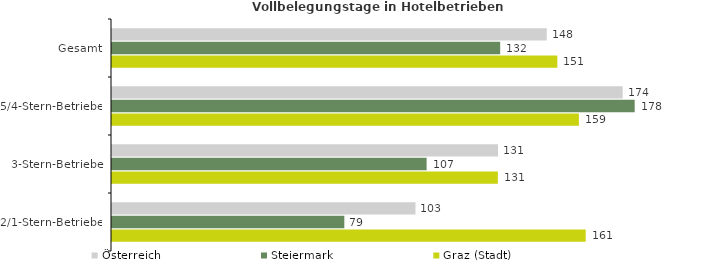
| Category | Österreich | Steiermark | Graz (Stadt) |
|---|---|---|---|
| Gesamt | 147.876 | 132.038 | 151.479 |
| 5/4-Stern-Betriebe | 173.697 | 177.779 | 158.809 |
| 3-Stern-Betriebe | 131.294 | 107.011 | 131.247 |
| 2/1-Stern-Betriebe | 103.222 | 79.024 | 161.125 |